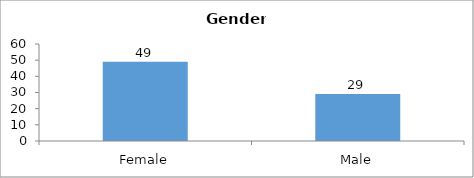
| Category | Gender |
|---|---|
| Female | 49 |
| Male | 29 |